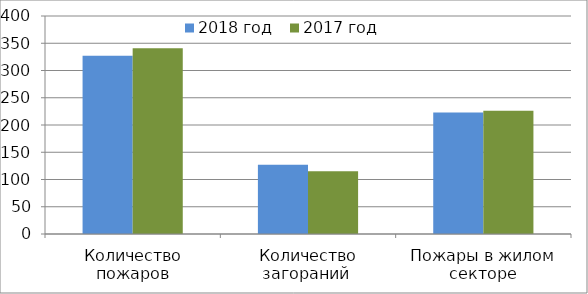
| Category | 2018 год | 2017 год |
|---|---|---|
| Количество пожаров | 327 | 341 |
| Количество загораний  | 127 | 115 |
| Пожары в жилом секторе | 223 | 226 |